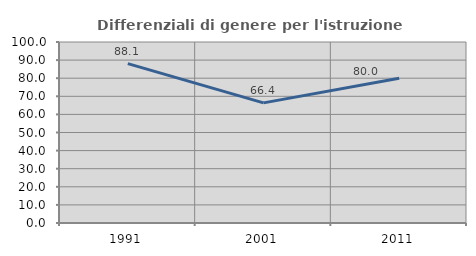
| Category | Differenziali di genere per l'istruzione superiore |
|---|---|
| 1991.0 | 88.068 |
| 2001.0 | 66.356 |
| 2011.0 | 80.027 |